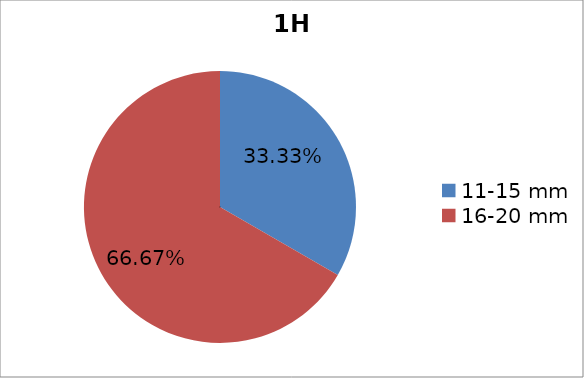
| Category | Series 0 |
|---|---|
| 11-15 mm | 0.333 |
| 16-20 mm | 0.667 |